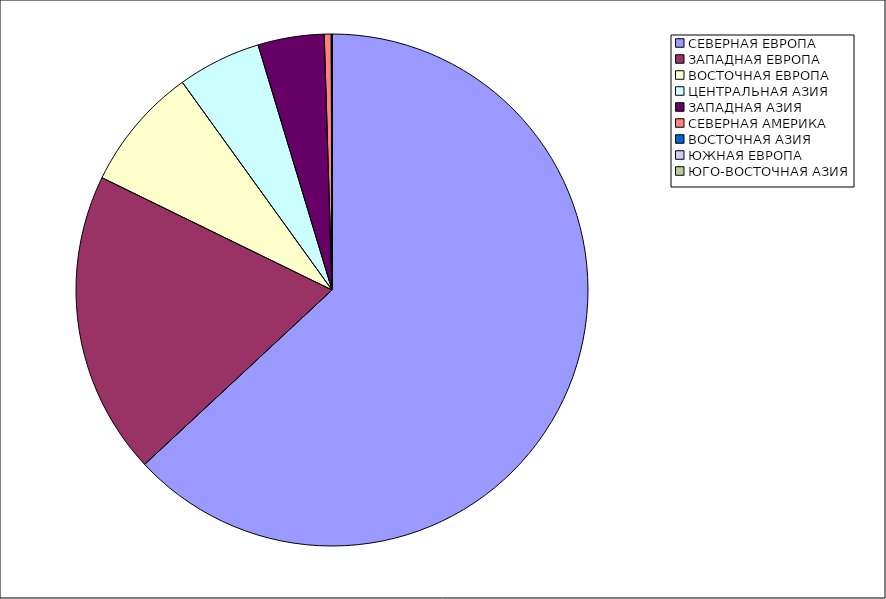
| Category | Оборот |
|---|---|
| СЕВЕРНАЯ ЕВРОПА | 63.068 |
| ЗАПАДНАЯ ЕВРОПА | 19.159 |
| ВОСТОЧНАЯ ЕВРОПА | 7.836 |
| ЦЕНТРАЛЬНАЯ АЗИЯ | 5.275 |
| ЗАПАДНАЯ АЗИЯ | 4.179 |
| СЕВЕРНАЯ АМЕРИКА | 0.436 |
| ВОСТОЧНАЯ АЗИЯ | 0.045 |
| ЮЖНАЯ ЕВРОПА | 0.002 |
| ЮГО-ВОСТОЧНАЯ АЗИЯ | 0.001 |